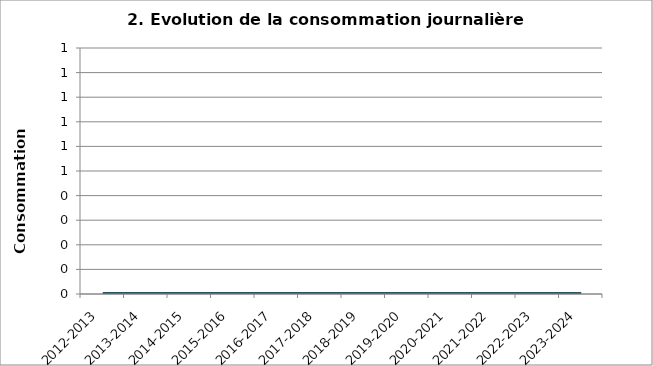
| Category | Consommation |
|---|---|
| 2012-2013 | 0 |
| 2013-2014 | 0 |
| 2014-2015 | 0 |
| 2015-2016 | 0 |
| 2016-2017 | 0 |
| 2017-2018 | 0 |
| 2018-2019 | 0 |
| 2019-2020 | 0 |
| 2020-2021 | 0 |
| 2021-2022 | 0 |
| 2022-2023 | 0 |
| 2023-2024 | 0 |